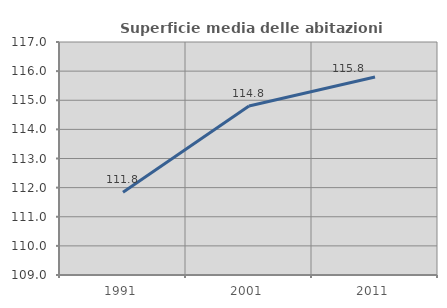
| Category | Superficie media delle abitazioni occupate |
|---|---|
| 1991.0 | 111.844 |
| 2001.0 | 114.805 |
| 2011.0 | 115.801 |